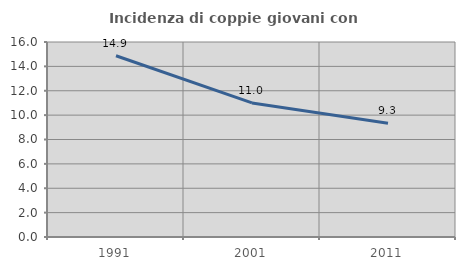
| Category | Incidenza di coppie giovani con figli |
|---|---|
| 1991.0 | 14.871 |
| 2001.0 | 11.002 |
| 2011.0 | 9.341 |